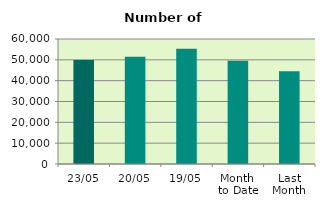
| Category | Series 0 |
|---|---|
| 23/05 | 49896 |
| 20/05 | 51468 |
| 19/05 | 55336 |
| Month 
to Date | 49540.625 |
| Last
Month | 44538 |